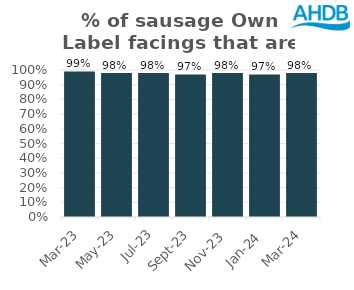
| Category | Sausage |
|---|---|
| 2023-03-01 | 0.99 |
| 2023-05-01 | 0.98 |
| 2023-07-01 | 0.98 |
| 2023-09-01 | 0.97 |
| 2023-11-01 | 0.98 |
| 2024-01-01 | 0.97 |
| 2024-03-01 | 0.98 |